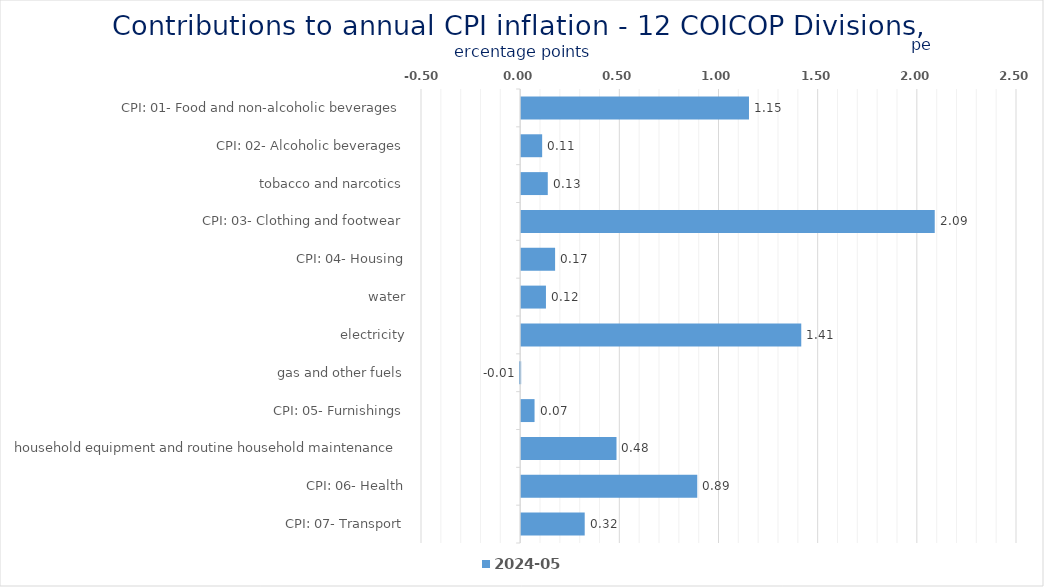
| Category | 2024-05 |
|---|---|
| CPI: 01- Food and non-alcoholic beverages | 1.149 |
| CPI: 02- Alcoholic beverages, tobacco and narcotics | 0.106 |
| CPI: 03- Clothing and footwear | 0.134 |
| CPI: 04- Housing, water, electricity, gas and other fuels | 2.085 |
| CPI: 05- Furnishings, household equipment and routine household maintenance | 0.171 |
| CPI: 06- Health | 0.125 |
| CPI: 07- Transport | 1.412 |
| CPI: 08- Communication | -0.005 |
| CPI: 09- Recreation and culture | 0.067 |
| CPI: 10- Education | 0.481 |
| CPI: 11- Restaurants and hotels | 0.888 |
| CPI: 12- Miscellaneous goods and services | 0.32 |